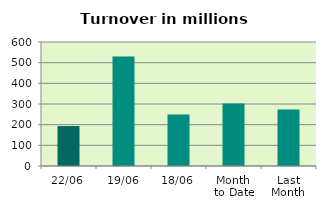
| Category | Series 0 |
|---|---|
| 22/06 | 193.277 |
| 19/06 | 529.367 |
| 18/06 | 248.76 |
| Month 
to Date | 302.156 |
| Last
Month | 273.813 |